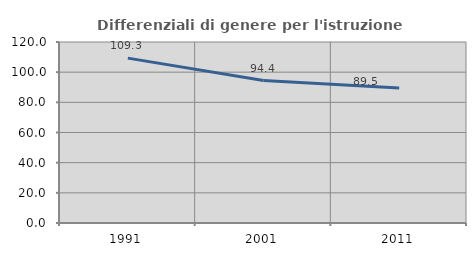
| Category | Differenziali di genere per l'istruzione superiore |
|---|---|
| 1991.0 | 109.321 |
| 2001.0 | 94.428 |
| 2011.0 | 89.494 |